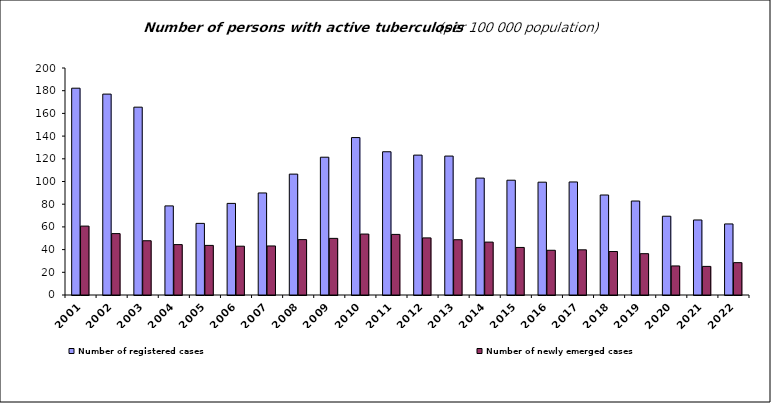
| Category | Number of registered cases                                                                                                | Number of newly emerged cases |
|---|---|---|
| 2001.0 | 182.2 | 60.7 |
| 2002.0 | 177 | 54.1 |
| 2003.0 | 165.5 | 47.8 |
| 2004.0 | 78.5 | 44.4 |
| 2005.0 | 63.1 | 43.7 |
| 2006.0 | 80.7 | 43 |
| 2007.0 | 89.9 | 43.2 |
| 2008.0 | 106.5 | 48.8 |
| 2009.0 | 121.4 | 49.9 |
| 2010.0 | 138.7 | 53.7 |
| 2011.0 | 126.2 | 53.4 |
| 2012.0 | 123.239 | 50.306 |
| 2013.0 | 122.4 | 48.7 |
| 2014.0 | 103 | 46.6 |
| 2015.0 | 101.141 | 41.9 |
| 2016.0 | 99.4 | 39.4 |
| 2017.0 | 99.6 | 39.8 |
| 2018.0 | 88.1 | 38.3 |
| 2019.0 | 82.8 | 36.4 |
| 2020.0 | 69.4 | 25.6 |
| 2021.0 | 66.1 | 25.2 |
| 2022.0 | 62.6 | 28.5 |